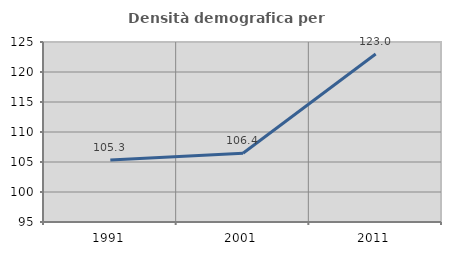
| Category | Densità demografica |
|---|---|
| 1991.0 | 105.334 |
| 2001.0 | 106.449 |
| 2011.0 | 123.01 |